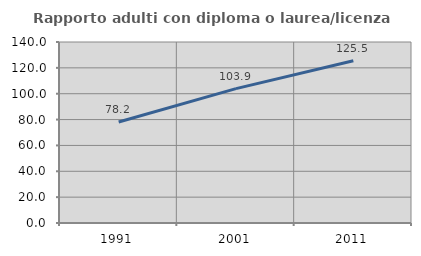
| Category | Rapporto adulti con diploma o laurea/licenza media  |
|---|---|
| 1991.0 | 78.156 |
| 2001.0 | 103.923 |
| 2011.0 | 125.484 |